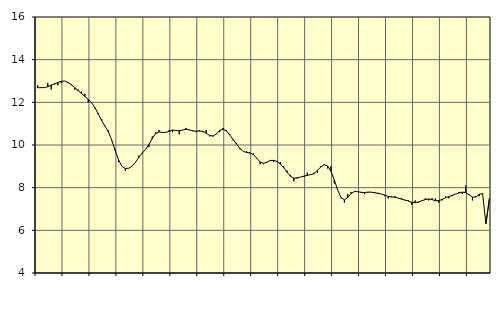
| Category | Piggar | Tillverkning av verkstadsvaror, SNI 25-30, 33 |
|---|---|---|
| nan | 12.8 | 12.68 |
| 87.0 | 12.7 | 12.69 |
| 87.0 | 12.7 | 12.69 |
| 87.0 | 12.9 | 12.73 |
| nan | 12.6 | 12.81 |
| 88.0 | 12.9 | 12.86 |
| 88.0 | 12.8 | 12.93 |
| 88.0 | 12.9 | 12.99 |
| nan | 13 | 13 |
| 89.0 | 12.9 | 12.93 |
| 89.0 | 12.8 | 12.83 |
| 89.0 | 12.6 | 12.69 |
| nan | 12.6 | 12.55 |
| 90.0 | 12.5 | 12.42 |
| 90.0 | 12.4 | 12.28 |
| 90.0 | 12 | 12.14 |
| nan | 12 | 11.98 |
| 91.0 | 11.7 | 11.75 |
| 91.0 | 11.5 | 11.44 |
| 91.0 | 11.2 | 11.13 |
| nan | 10.9 | 10.88 |
| 92.0 | 10.7 | 10.61 |
| 92.0 | 10.2 | 10.22 |
| 92.0 | 9.8 | 9.74 |
| nan | 9.2 | 9.3 |
| 93.0 | 9 | 9 |
| 93.0 | 8.8 | 8.9 |
| 93.0 | 8.9 | 8.91 |
| nan | 9 | 9.01 |
| 94.0 | 9.2 | 9.19 |
| 94.0 | 9.5 | 9.42 |
| 94.0 | 9.6 | 9.62 |
| nan | 9.8 | 9.79 |
| 95.0 | 9.9 | 10.03 |
| 95.0 | 10.4 | 10.31 |
| 95.0 | 10.6 | 10.53 |
| nan | 10.7 | 10.61 |
| 96.0 | 10.6 | 10.59 |
| 96.0 | 10.6 | 10.59 |
| 96.0 | 10.7 | 10.64 |
| nan | 10.6 | 10.7 |
| 97.0 | 10.7 | 10.68 |
| 97.0 | 10.5 | 10.67 |
| 97.0 | 10.7 | 10.7 |
| nan | 10.8 | 10.74 |
| 98.0 | 10.7 | 10.71 |
| 98.0 | 10.7 | 10.66 |
| 98.0 | 10.6 | 10.65 |
| nan | 10.7 | 10.65 |
| 99.0 | 10.6 | 10.64 |
| 99.0 | 10.7 | 10.55 |
| 99.0 | 10.4 | 10.45 |
| nan | 10.4 | 10.42 |
| 0.0 | 10.5 | 10.52 |
| 0.0 | 10.6 | 10.68 |
| 0.0 | 10.8 | 10.74 |
| nan | 10.7 | 10.66 |
| 1.0 | 10.5 | 10.47 |
| 1.0 | 10.2 | 10.25 |
| 1.0 | 10.1 | 10.04 |
| nan | 9.8 | 9.84 |
| 2.0 | 9.7 | 9.7 |
| 2.0 | 9.7 | 9.65 |
| 2.0 | 9.6 | 9.63 |
| nan | 9.6 | 9.55 |
| 3.0 | 9.4 | 9.38 |
| 3.0 | 9.1 | 9.2 |
| 3.0 | 9.1 | 9.14 |
| nan | 9.2 | 9.19 |
| 4.0 | 9.3 | 9.27 |
| 4.0 | 9.2 | 9.28 |
| 4.0 | 9.2 | 9.23 |
| nan | 9.2 | 9.11 |
| 5.0 | 9 | 8.93 |
| 5.0 | 8.8 | 8.72 |
| 5.0 | 8.6 | 8.53 |
| nan | 8.3 | 8.45 |
| 6.0 | 8.5 | 8.45 |
| 6.0 | 8.5 | 8.5 |
| 6.0 | 8.5 | 8.54 |
| nan | 8.7 | 8.58 |
| 7.0 | 8.6 | 8.61 |
| 7.0 | 8.7 | 8.66 |
| 7.0 | 8.7 | 8.81 |
| nan | 9 | 8.97 |
| 8.0 | 9.1 | 9.08 |
| 8.0 | 8.9 | 9.02 |
| 8.0 | 9 | 8.77 |
| nan | 8.2 | 8.37 |
| 9.0 | 7.9 | 7.89 |
| 9.0 | 7.5 | 7.54 |
| 9.0 | 7.3 | 7.43 |
| nan | 7.7 | 7.54 |
| 10.0 | 7.8 | 7.73 |
| 10.0 | 7.8 | 7.82 |
| 10.0 | 7.8 | 7.81 |
| nan | 7.8 | 7.78 |
| 11.0 | 7.7 | 7.77 |
| 11.0 | 7.8 | 7.79 |
| 11.0 | 7.8 | 7.79 |
| nan | 7.8 | 7.76 |
| 12.0 | 7.7 | 7.74 |
| 12.0 | 7.7 | 7.7 |
| 12.0 | 7.6 | 7.65 |
| nan | 7.5 | 7.59 |
| 13.0 | 7.6 | 7.56 |
| 13.0 | 7.6 | 7.55 |
| 13.0 | 7.5 | 7.51 |
| nan | 7.5 | 7.46 |
| 14.0 | 7.4 | 7.42 |
| 14.0 | 7.4 | 7.37 |
| 14.0 | 7.2 | 7.31 |
| nan | 7.4 | 7.3 |
| 15.0 | 7.3 | 7.33 |
| 15.0 | 7.4 | 7.39 |
| 15.0 | 7.5 | 7.44 |
| nan | 7.4 | 7.47 |
| 16.0 | 7.5 | 7.44 |
| 16.0 | 7.5 | 7.39 |
| 16.0 | 7.3 | 7.39 |
| nan | 7.4 | 7.45 |
| 17.0 | 7.6 | 7.53 |
| 17.0 | 7.5 | 7.58 |
| 17.0 | 7.6 | 7.64 |
| nan | 7.7 | 7.7 |
| 18.0 | 7.8 | 7.75 |
| 18.0 | 7.7 | 7.79 |
| 18.0 | 8.1 | 7.77 |
| nan | 7.7 | 7.67 |
| 19.0 | 7.4 | 7.56 |
| 19.0 | 7.6 | 7.56 |
| 19.0 | 7.6 | 7.69 |
| nan | 7.7 | 7.72 |
| 20.0 | 6.3 | 6.31 |
| 20.0 | 7.5 | 7.45 |